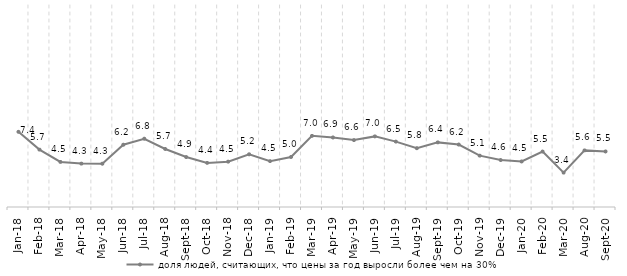
| Category | доля людей, считающих, что цены за год выросли более чем на 30% |
|---|---|
| 2018-01-01 | 7.445 |
| 2018-02-01 | 5.682 |
| 2018-03-01 | 4.463 |
| 2018-04-01 | 4.296 |
| 2018-05-01 | 4.287 |
| 2018-06-01 | 6.164 |
| 2018-07-01 | 6.758 |
| 2018-08-01 | 5.744 |
| 2018-09-01 | 4.946 |
| 2018-10-01 | 4.368 |
| 2018-11-01 | 4.491 |
| 2018-12-01 | 5.219 |
| 2019-01-01 | 4.543 |
| 2019-02-01 | 4.953 |
| 2019-03-01 | 7.044 |
| 2019-04-01 | 6.883 |
| 2019-05-01 | 6.627 |
| 2019-06-01 | 6.991 |
| 2019-07-01 | 6.476 |
| 2019-08-01 | 5.822 |
| 2019-09-01 | 6.397 |
| 2019-10-01 | 6.183 |
| 2019-11-01 | 5.085 |
| 2019-12-01 | 4.649 |
| 2020-01-01 | 4.51 |
| 2020-02-01 | 5.488 |
| 2020-03-01 | 3.403 |
| 2020-08-01 | 5.606 |
| 2020-09-01 | 5.496 |